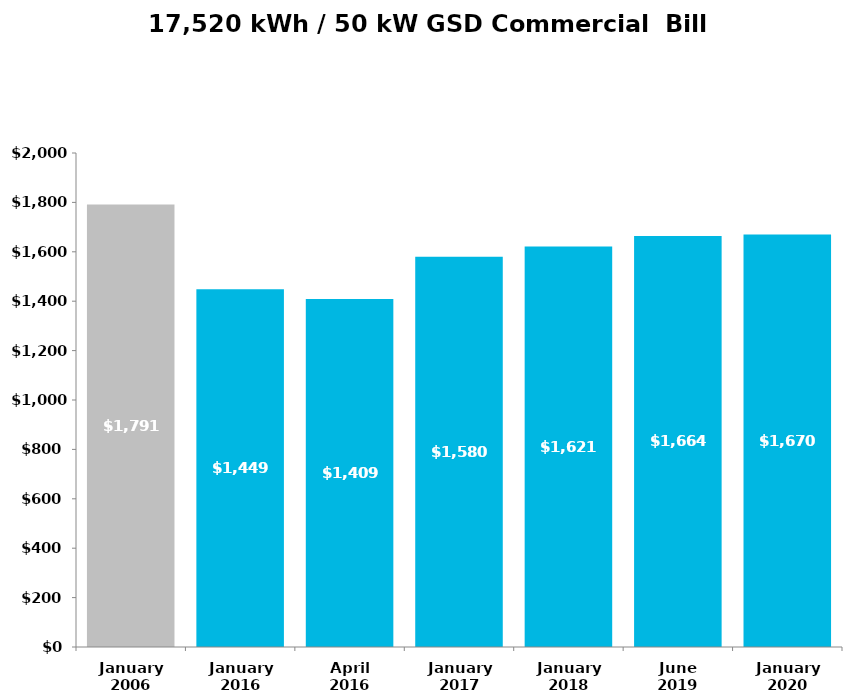
| Category | Total | Series 1 | Series 2 | Series 3 |
|---|---|---|---|---|
| January
2006 | 1791 |  |  |  |
| January
2016 | 1448.77 |  |  |  |
| April
2016 | 1409.2 |  |  |  |
| January
2017 | 1580.42 |  |  |  |
| January
2018 | 1621.34 |  |  |  |
| June
2019 | 1664.1 |  |  |  |
| January
2020 | 1670.3 |  |  |  |